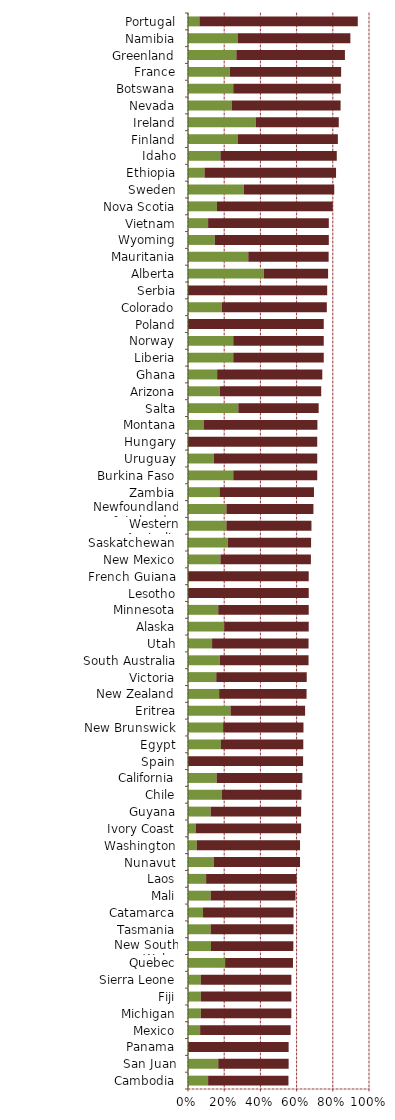
| Category | Series 0 | Series 1 |
|---|---|---|
| Cambodia | 0.111 | 0.444 |
| San Juan | 0.167 | 0.389 |
| Panama | 0 | 0.556 |
| Mexico | 0.067 | 0.5 |
| Michigan | 0.071 | 0.5 |
| Fiji | 0.071 | 0.5 |
| Sierra Leone | 0.071 | 0.5 |
| Quebec | 0.205 | 0.375 |
| New South Wales | 0.127 | 0.455 |
| Tasmania | 0.125 | 0.458 |
| Catamarca | 0.083 | 0.5 |
| Mali | 0.125 | 0.469 |
| Laos | 0.1 | 0.5 |
| Nunavut | 0.143 | 0.476 |
| Washington | 0.048 | 0.571 |
| Ivory Coast | 0.042 | 0.583 |
| Guyana | 0.125 | 0.5 |
| Chile | 0.186 | 0.441 |
| California | 0.158 | 0.474 |
| Spain | 0 | 0.636 |
| Egypt | 0.182 | 0.455 |
| New Brunswick | 0.194 | 0.444 |
| Eritrea | 0.235 | 0.412 |
| New Zealand | 0.172 | 0.483 |
| Victoria | 0.156 | 0.5 |
| South Australia | 0.176 | 0.49 |
| Utah | 0.133 | 0.533 |
| Alaska | 0.2 | 0.467 |
| Minnesota | 0.167 | 0.5 |
| Lesotho | 0 | 0.667 |
| French Guiana | 0 | 0.667 |
| New Mexico | 0.179 | 0.5 |
| Saskatchewan | 0.22 | 0.46 |
| Western Australia | 0.212 | 0.47 |
| Newfoundland & Labrador | 0.212 | 0.481 |
| Zambia | 0.174 | 0.522 |
| Burkina Faso | 0.25 | 0.464 |
| Uruguay | 0.143 | 0.571 |
| Hungary | 0 | 0.714 |
| Montana | 0.086 | 0.629 |
| Salta | 0.278 | 0.444 |
| Arizona | 0.175 | 0.561 |
| Ghana | 0.161 | 0.581 |
| Liberia | 0.25 | 0.5 |
| Norway | 0.25 | 0.5 |
| Poland | 0 | 0.75 |
| Colorado | 0.186 | 0.581 |
| Serbia | 0 | 0.769 |
| Alberta | 0.419 | 0.355 |
| Mauritania | 0.333 | 0.444 |
| Wyoming | 0.148 | 0.63 |
| Vietnam | 0.111 | 0.667 |
| Nova Scotia | 0.16 | 0.64 |
| Sweden | 0.308 | 0.5 |
| Ethiopia | 0.091 | 0.727 |
| Idaho | 0.179 | 0.643 |
| Finland | 0.276 | 0.552 |
| Ireland | 0.375 | 0.458 |
| Nevada | 0.241 | 0.602 |
| Botswana | 0.25 | 0.594 |
| France | 0.231 | 0.615 |
| Greenland | 0.267 | 0.6 |
| Namibia | 0.276 | 0.621 |
| Portugal | 0.063 | 0.875 |